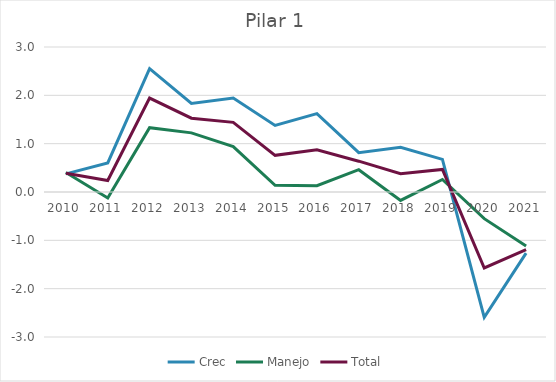
| Category | Crec | Manejo | Total |
|---|---|---|---|
| 2010.0 | 0.375 | 0.404 | 0.389 |
| 2011.0 | 0.6 | -0.123 | 0.239 |
| 2012.0 | 2.554 | 1.332 | 1.943 |
| 2013.0 | 1.831 | 1.223 | 1.527 |
| 2014.0 | 1.943 | 0.94 | 1.442 |
| 2015.0 | 1.377 | 0.14 | 0.759 |
| 2016.0 | 1.622 | 0.129 | 0.876 |
| 2017.0 | 0.813 | 0.462 | 0.637 |
| 2018.0 | 0.927 | -0.174 | 0.376 |
| 2019.0 | 0.676 | 0.259 | 0.468 |
| 2020.0 | -2.592 | -0.552 | -1.572 |
| 2021.0 | -1.266 | -1.118 | -1.192 |